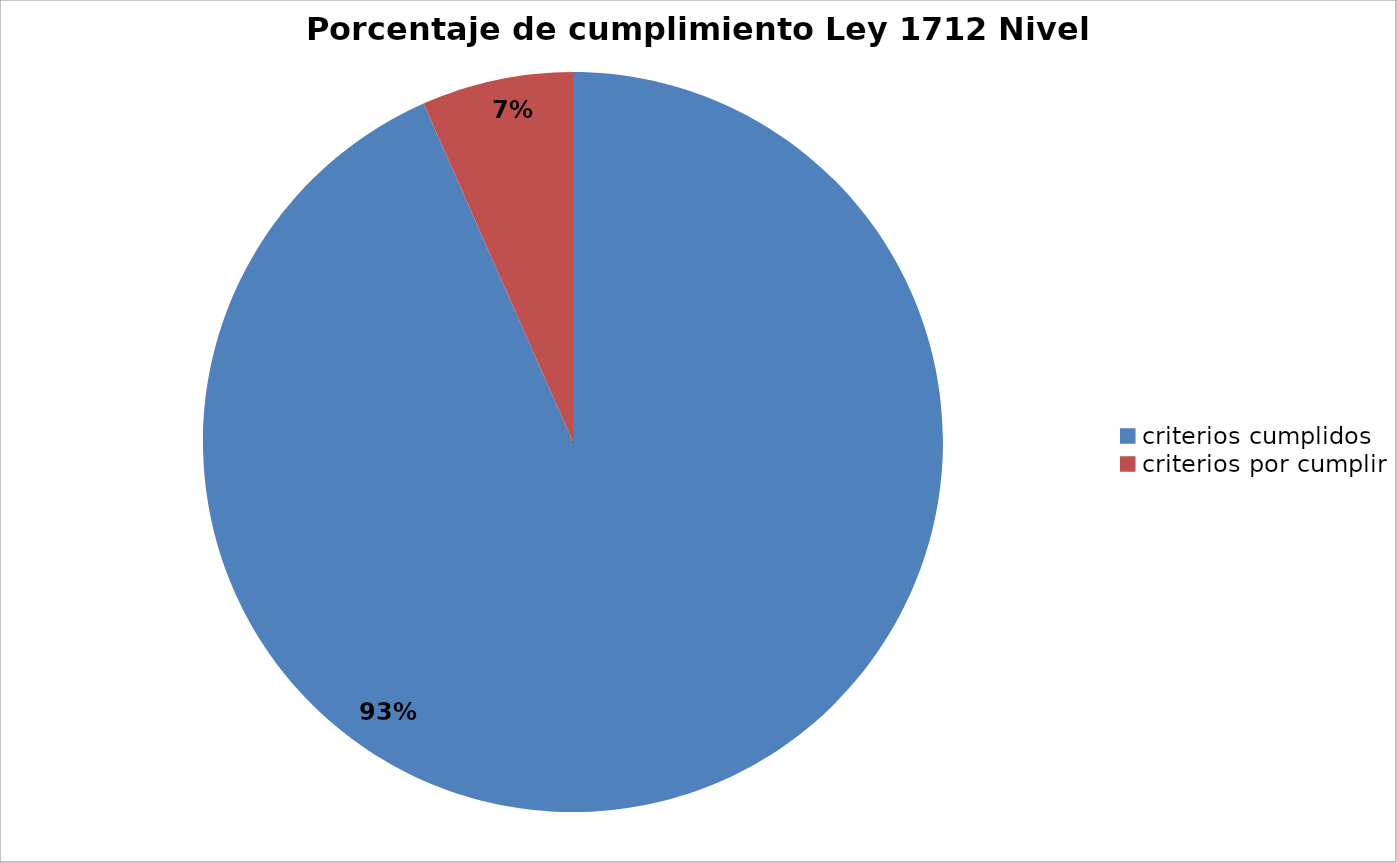
| Category | Series 0 |
|---|---|
| criterios cumplidos | 127 |
| criterios por cumplir | 9 |